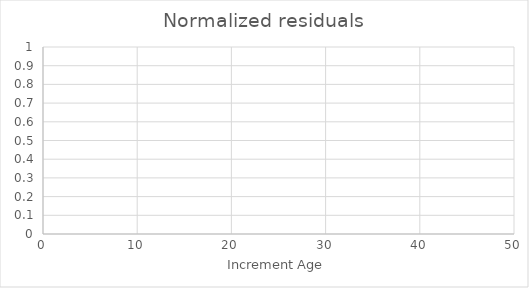
| Category | To 
(months) |
|---|---|
| 12.0 | 0 |
| 24.0 | 0 |
| 36.0 | 0 |
| 48.0 | 0 |
| 12.0 | 0 |
| 24.0 | 0 |
| 36.0 | 0 |
| 12.0 | 0 |
| 24.0 | 0 |
| 12.0 | 0 |